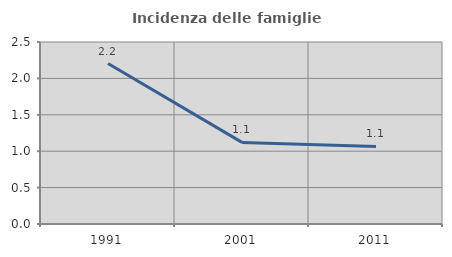
| Category | Incidenza delle famiglie numerose |
|---|---|
| 1991.0 | 2.204 |
| 2001.0 | 1.121 |
| 2011.0 | 1.066 |